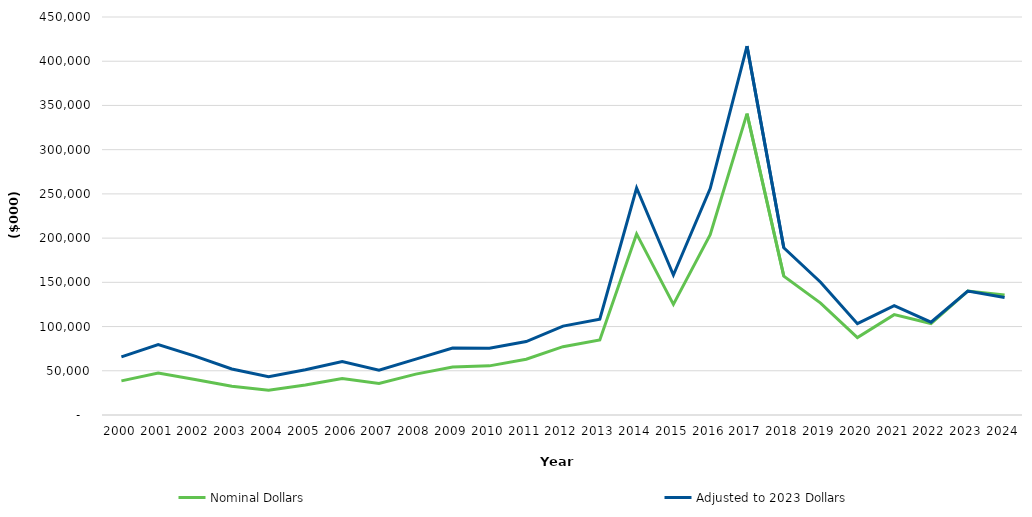
| Category | Nominal Dollars | Adjusted to 2023 Dollars |
|---|---|---|
| 2000.0 | 38563 | 65634.602 |
| 2001.0 | 47501 | 79517.339 |
| 2002.0 | 40217 | 66507.858 |
| 2003.0 | 32506 | 52057.718 |
| 2004.0 | 27964 | 43370.447 |
| 2005.0 | 33952 | 51064.927 |
| 2006.0 | 41217 | 60428.068 |
| 2007.0 | 35669 | 50636.179 |
| 2008.0 | 46246 | 63135.201 |
| 2009.0 | 54152 | 75678.591 |
| 2010.0 | 55553 | 75485.28 |
| 2011.0 | 63116 | 83075.63 |
| 2012.0 | 77252 | 100458.67 |
| 2013.0 | 84755 | 108334.705 |
| 2014.0 | 204728 | 256688.987 |
| 2015.0 | 125119 | 158261.855 |
| 2016.0 | 203941 | 256042.328 |
| 2017.0 | 340740.8 | 417090.105 |
| 2018.0 | 156985.1 | 189094.514 |
| 2019.0 | 126574.9 | 150119.831 |
| 2020.0 | 87555.4 | 103248.451 |
| 2021.0 | 113492.1 | 123713.282 |
| 2022.0 | 103408 | 104974.147 |
| 2023.0 | 140151 | 140151 |
| 2024.0 | 135604 | 132875.108 |